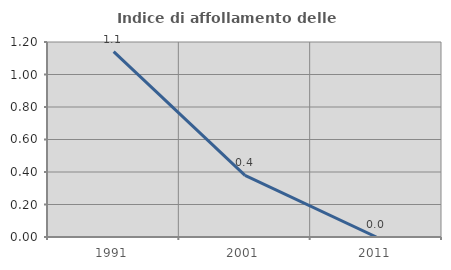
| Category | Indice di affollamento delle abitazioni  |
|---|---|
| 1991.0 | 1.141 |
| 2001.0 | 0.379 |
| 2011.0 | 0 |